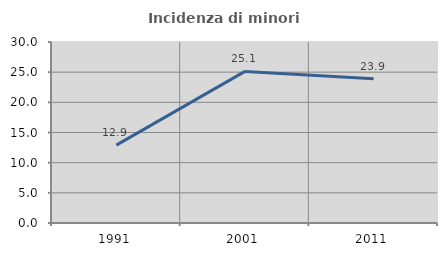
| Category | Incidenza di minori stranieri |
|---|---|
| 1991.0 | 12.903 |
| 2001.0 | 25.123 |
| 2011.0 | 23.922 |